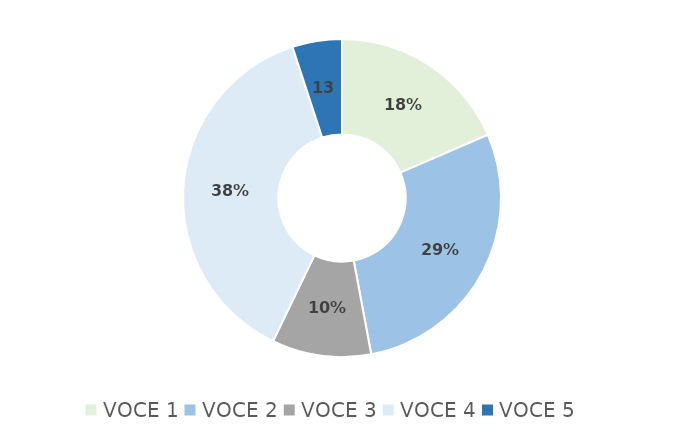
| Category | Series 0 |
|---|---|
| VOCE 1 | 22 |
| VOCE 2 | 34 |
| VOCE 3 | 12 |
| VOCE 4 | 45 |
| VOCE 5 | 6 |